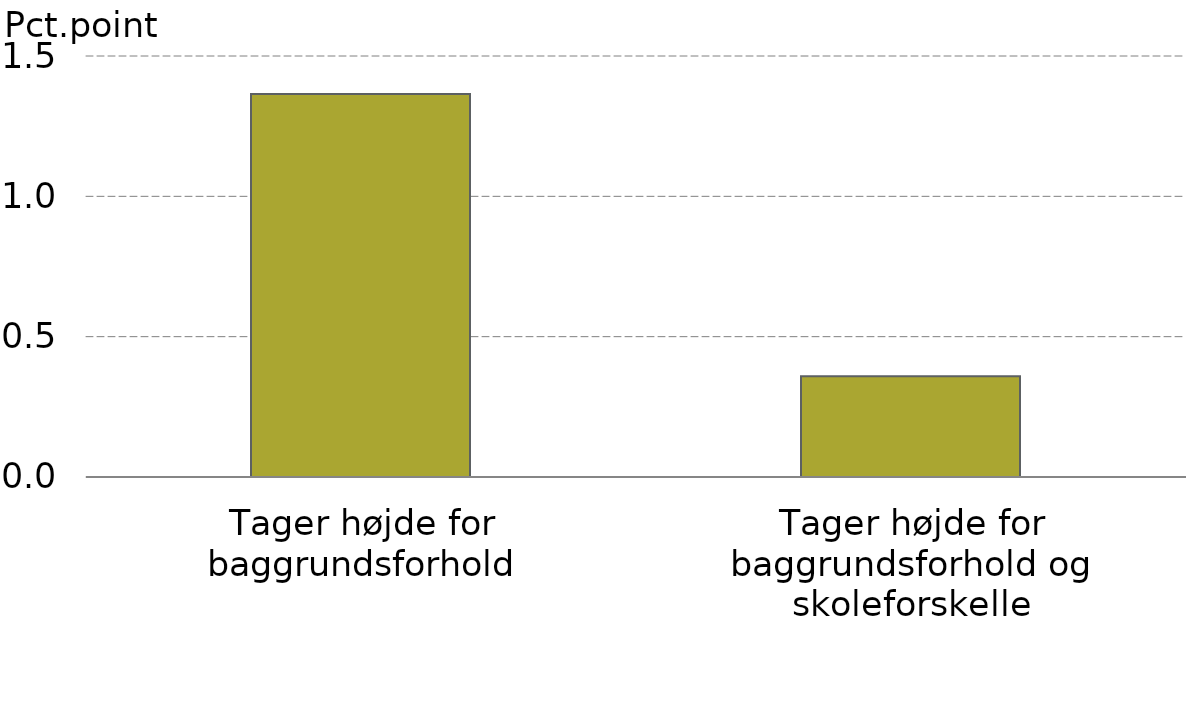
| Category |  Serie1 |
|---|---|
| Tager højde for baggrundsforhold | 1.364 |
| Tager højde for baggrundsforhold og skoleforskelle | 0.359 |